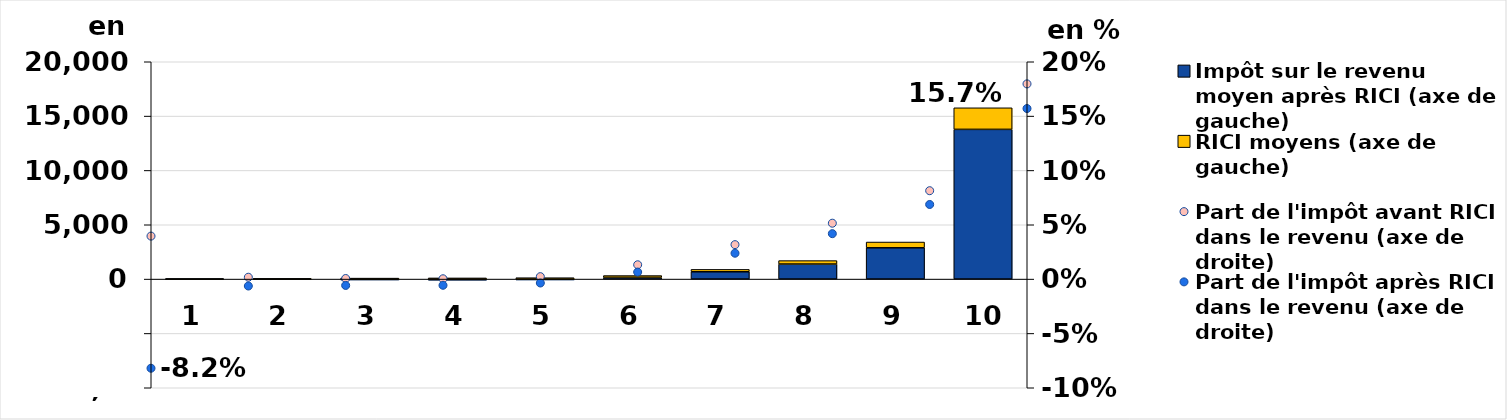
| Category | Impôt sur le revenu moyen après RICI (axe de gauche) | RICI moyens (axe de gauche) |
|---|---|---|
| 0 | -28.1 | 41.763 |
| 1 | -49.122 | 64.485 |
| 2 | -79.459 | 89.996 |
| 3 | -98.283 | 107.674 |
| 4 | -74.078 | 128.47 |
| 5 | 162.169 | 162.006 |
| 6 | 672.515 | 220.864 |
| 7 | 1383.828 | 316.678 |
| 8 | 2880.55 | 529.921 |
| 9 | 13777.04 | 1986.947 |